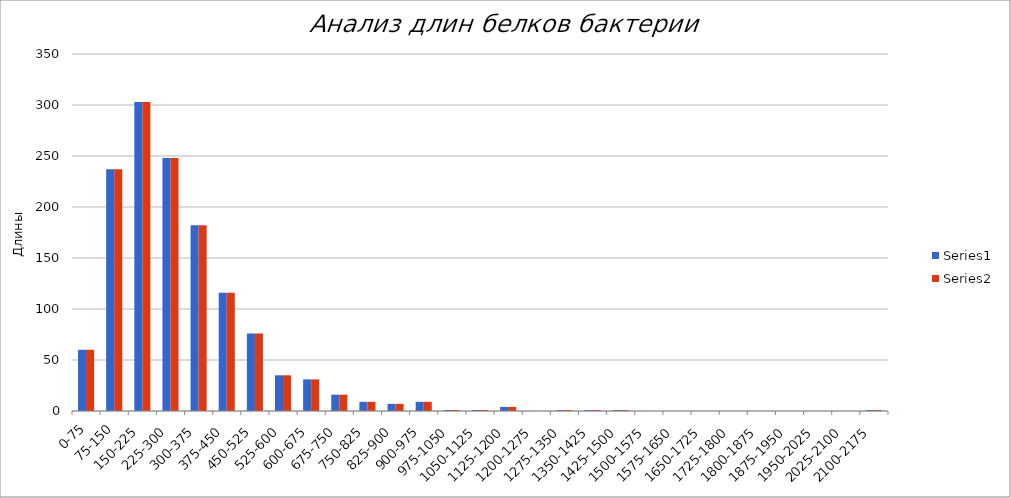
| Category | Series 0 | Series 1 |
|---|---|---|
| 0-75 | 60 | 60 |
| 75-150 | 237 | 237 |
| 150-225 | 303 | 303 |
| 225-300 | 248 | 248 |
| 300-375 | 182 | 182 |
| 375-450 | 116 | 116 |
| 450-525 | 76 | 76 |
| 525-600 | 35 | 35 |
| 600-675 | 31 | 31 |
| 675-750 | 16 | 16 |
| 750-825 | 9 | 9 |
| 825-900 | 7 | 7 |
| 900-975 | 9 | 9 |
| 975-1050 | 1 | 1 |
| 1050-1125 | 1 | 1 |
| 1125-1200 | 4 | 4 |
| 1200-1275 | 0 | 0 |
| 1275-1350 | 1 | 1 |
| 1350-1425 | 1 | 1 |
| 1425-1500 | 1 | 1 |
| 1500-1575 | 0 | 0 |
| 1575-1650 | 0 | 0 |
| 1650-1725 | 0 | 0 |
| 1725-1800 | 0 | 0 |
| 1800-1875 | 0 | 0 |
| 1875-1950 | 0 | 0 |
| 1950-2025 | 0 | 0 |
| 2025-2100 | 0 | 0 |
| 2100-2175 | 1 | 1 |